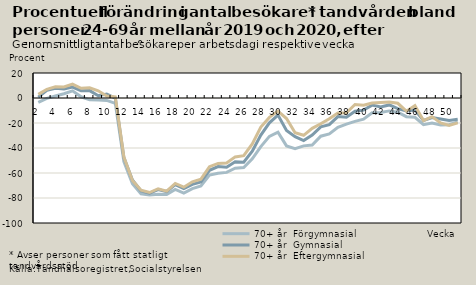
| Category | 70+ år  |
|---|---|
| 2.0 | 2.883 |
| 3.0 | 6.973 |
| 4.0 | 8.953 |
| 5.0 | 8.843 |
| 6.0 | 11.168 |
| 7.0 | 7.754 |
| 8.0 | 8.125 |
| 9.0 | 5.75 |
| 10.0 | 1.513 |
| 11.0 | 0.975 |
| 12.0 | -47.225 |
| 13.0 | -65.993 |
| 14.0 | -73.819 |
| 15.0 | -75.608 |
| 16.0 | -72.596 |
| 17.0 | -74.553 |
| 18.0 | -68.368 |
| 19.0 | -71.34 |
| 20.0 | -67.044 |
| 21.0 | -64.927 |
| 22.0 | -54.899 |
| 23.0 | -52.307 |
| 24.0 | -52.027 |
| 25.0 | -47.117 |
| 26.0 | -46.135 |
| 27.0 | -36.707 |
| 28.0 | -23.241 |
| 29.0 | -15.509 |
| 30.0 | -10.493 |
| 31.0 | -16.42 |
| 32.0 | -27.754 |
| 33.0 | -29.843 |
| 34.0 | -24.291 |
| 35.0 | -20.563 |
| 36.0 | -16.587 |
| 37.0 | -11.925 |
| 38.0 | -11.781 |
| 39.0 | -5.172 |
| 40.0 | -5.815 |
| 41.0 | -3.996 |
| 42.0 | -3.58 |
| 43.0 | -3.132 |
| 44.0 | -4.221 |
| 45.0 | -10.522 |
| 46.0 | -6.06 |
| 47.0 | -18.008 |
| 48.0 | -14.893 |
| 49.0 | -19.912 |
| 50.0 | -21.87 |
| 51.0 | -19.852 |